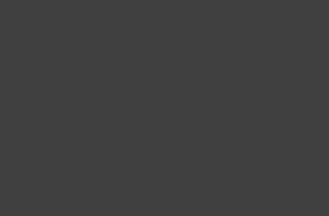
| Category | Series 1 |
|---|---|
| Mike | 80 |
| Sarah | 80 |
| Bob | 80 |
| Jordan | 80 |
| Danny | 80 |
| Morgan | 80 |
| Whitney | 80 |